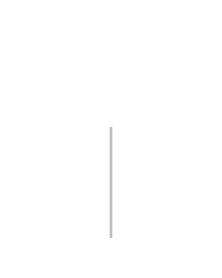
| Category | Dodatnia | Ujemna |
|---|---|---|
| 0 | 0 | 0 |
| 1 | 192 | 0 |
| 2 | 192 | -192 |